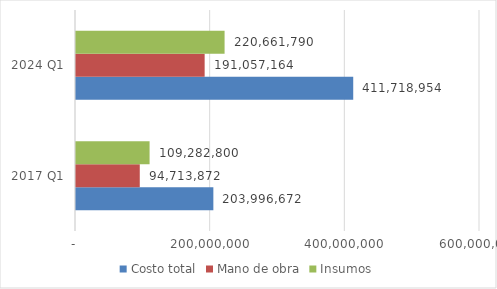
| Category | Costo total | Mano de obra | Insumos |
|---|---|---|---|
| 2017 Q1 | 203996672 | 94713872 | 109282800 |
| 2024 Q1 | 411718954.36 | 191057164 | 220661790.36 |